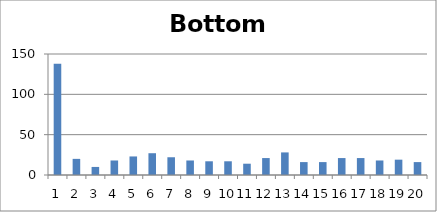
| Category | Bottom Slice |
|---|---|
| 0 | 138 |
| 1 | 20 |
| 2 | 10 |
| 3 | 18 |
| 4 | 23 |
| 5 | 27 |
| 6 | 22 |
| 7 | 18 |
| 8 | 17 |
| 9 | 17 |
| 10 | 14 |
| 11 | 21 |
| 12 | 28 |
| 13 | 16 |
| 14 | 16 |
| 15 | 21 |
| 16 | 21 |
| 17 | 18 |
| 18 | 19 |
| 19 | 16 |